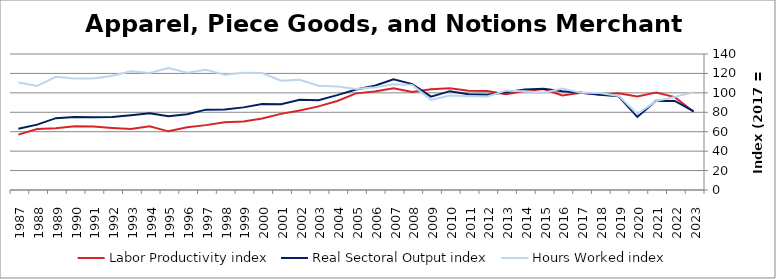
| Category | Labor Productivity index | Real Sectoral Output index | Hours Worked index |
|---|---|---|---|
| 2023.0 | 80.521 | 81.013 | 100.61 |
| 2022.0 | 95.641 | 91.676 | 95.855 |
| 2021.0 | 100.373 | 91.819 | 91.477 |
| 2020.0 | 96.37 | 75.332 | 78.17 |
| 2019.0 | 99.641 | 96.522 | 96.87 |
| 2018.0 | 98.286 | 98.173 | 99.885 |
| 2017.0 | 100 | 100 | 100 |
| 2016.0 | 97.369 | 101.649 | 104.395 |
| 2015.0 | 104.02 | 104.266 | 100.237 |
| 2014.0 | 101.79 | 103.461 | 101.642 |
| 2013.0 | 98.461 | 100.704 | 102.278 |
| 2012.0 | 101.837 | 97.947 | 96.18 |
| 2011.0 | 102.099 | 98.59 | 96.563 |
| 2010.0 | 104.695 | 101.743 | 97.18 |
| 2009.0 | 103.631 | 96.147 | 92.777 |
| 2008.0 | 100.782 | 109.007 | 108.161 |
| 2007.0 | 104.653 | 113.974 | 108.906 |
| 2006.0 | 101.494 | 107.383 | 105.803 |
| 2005.0 | 99.486 | 103.467 | 104.002 |
| 2004.0 | 91.648 | 97.682 | 106.583 |
| 2003.0 | 86.069 | 92.436 | 107.398 |
| 2002.0 | 81.853 | 92.9 | 113.496 |
| 2001.0 | 78.358 | 88.18 | 112.536 |
| 2000.0 | 73.632 | 88.603 | 120.332 |
| 1999.0 | 70.478 | 85.055 | 120.683 |
| 1998.0 | 69.847 | 82.913 | 118.707 |
| 1997.0 | 66.775 | 82.72 | 123.878 |
| 1996.0 | 64.668 | 78.036 | 120.672 |
| 1995.0 | 60.383 | 75.804 | 125.538 |
| 1994.0 | 65.591 | 78.954 | 120.374 |
| 1993.0 | 62.867 | 76.855 | 122.249 |
| 1992.0 | 63.876 | 75.128 | 117.615 |
| 1991.0 | 65.26 | 74.846 | 114.69 |
| 1990.0 | 65.505 | 75.224 | 114.837 |
| 1989.0 | 63.478 | 73.95 | 116.497 |
| 1988.0 | 62.777 | 67.272 | 107.16 |
| 1987.0 | 56.988 | 63.026 | 110.595 |